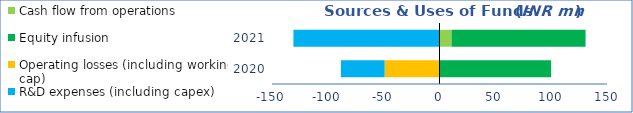
| Category | Cash flow from operations | Equity infusion | Operating losses (including working cap) | R&D expenses (including capex) |
|---|---|---|---|---|
| 2020-03-31 | 0 | 100 | -49.13 | -39.186 |
| 2021-03-31 | 10.799 | 120 | 0 | -130.829 |